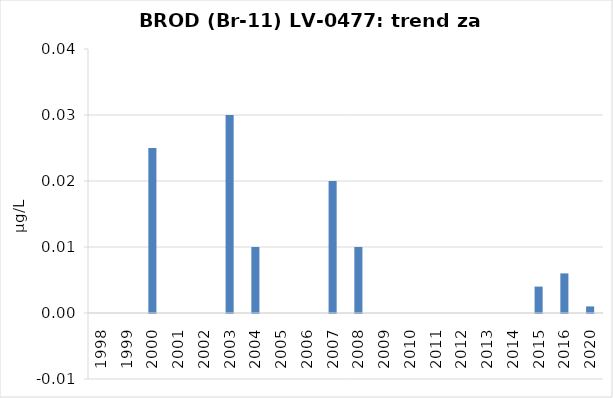
| Category | Vsota |
|---|---|
| 1998 | 0 |
| 1999 | 0 |
| 2000 | 0.025 |
| 2001 | 0 |
| 2002 | 0 |
| 2003 | 0.03 |
| 2004 | 0.01 |
| 2005 | 0 |
| 2006 | 0 |
| 2007 | 0.02 |
| 2008 | 0.01 |
| 2009 | 0 |
| 2010 | 0 |
| 2011 | 0 |
| 2012 | 0 |
| 2013 | 0 |
| 2014 | 0 |
| 2015 | 0.004 |
| 2016 | 0.006 |
| 2020 | 0.001 |